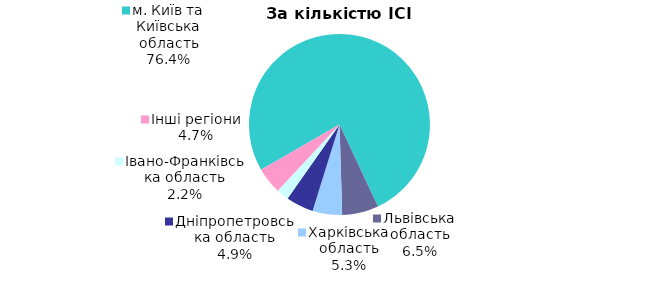
| Category | Series 0 |
|---|---|
| м. Київ та Київська область | 0.764 |
| Львівська область | 0.065 |
| Харківська область | 0.053 |
| Дніпропетровська область | 0.049 |
| Iвано-Франкiвська область | 0.022 |
| Інші регіони | 0.047 |